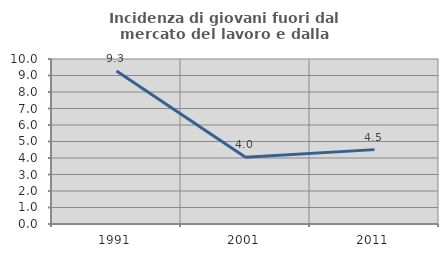
| Category | Incidenza di giovani fuori dal mercato del lavoro e dalla formazione  |
|---|---|
| 1991.0 | 9.277 |
| 2001.0 | 4.039 |
| 2011.0 | 4.508 |